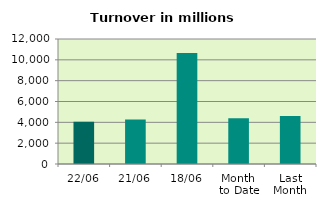
| Category | Series 0 |
|---|---|
| 22/06 | 4050.37 |
| 21/06 | 4283.982 |
| 18/06 | 10658.123 |
| Month 
to Date | 4396.729 |
| Last
Month | 4609.327 |